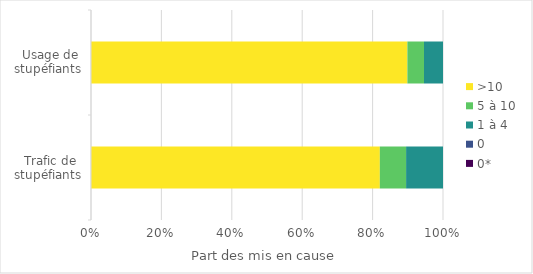
| Category | >10 | 5 à 10 | 1 à 4 | 0 | 0* |
|---|---|---|---|---|---|
|  Trafic de stupéfiants | 40700 | 3700 | 5200 | 0 | 0 |
|  Usage de stupéfiants | 226500 | 11900 | 13600 | 0 | 0 |